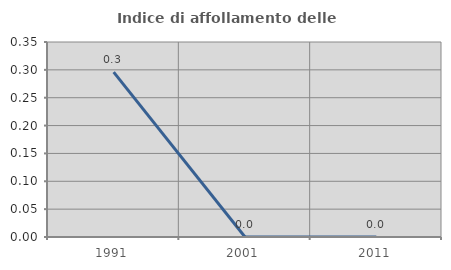
| Category | Indice di affollamento delle abitazioni  |
|---|---|
| 1991.0 | 0.296 |
| 2001.0 | 0 |
| 2011.0 | 0 |